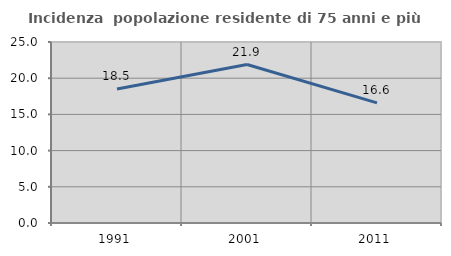
| Category | Incidenza  popolazione residente di 75 anni e più |
|---|---|
| 1991.0 | 18.519 |
| 2001.0 | 21.887 |
| 2011.0 | 16.596 |